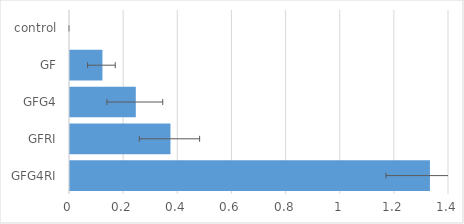
| Category | Series 0 |
|---|---|
| GFG4RI | 1.33 |
| GFRI | 0.371 |
| GFG4 | 0.243 |
| GF | 0.12 |
| control | 0 |